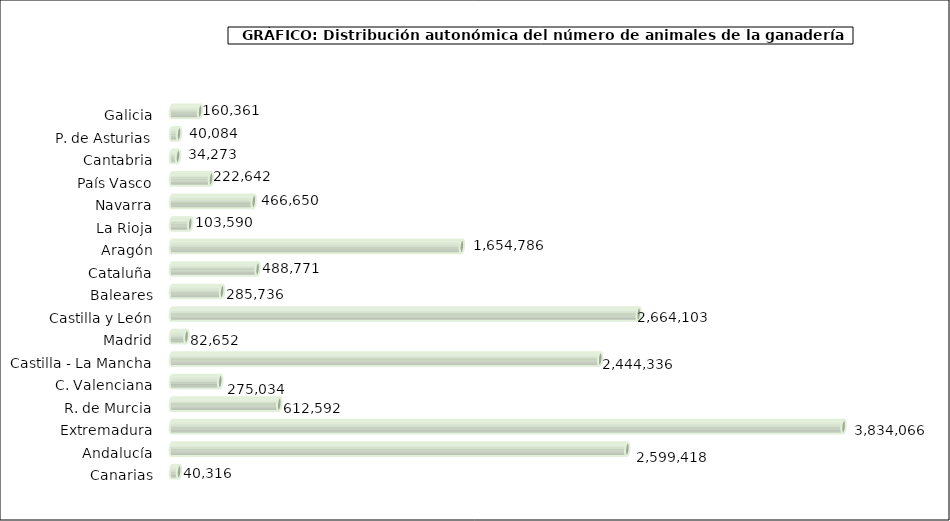
| Category | num. Animales |
|---|---|
|   Galicia | 160361 |
|   P. de Asturias | 40084 |
|   Cantabria | 34273 |
|   País Vasco | 222642 |
|   Navarra | 466650 |
|   La Rioja | 103590 |
|   Aragón | 1654786 |
|   Cataluña | 488771 |
|   Baleares | 285736 |
|   Castilla y León | 2664103 |
|   Madrid | 82652 |
|   Castilla - La Mancha | 2444336 |
|   C. Valenciana | 275034 |
|   R. de Murcia | 612592 |
|   Extremadura | 3834066 |
|   Andalucía | 2599418 |
|   Canarias | 40316 |